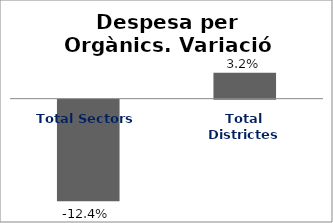
| Category | Series 0 |
|---|---|
| Total Sectors | -0.124 |
| Total Districtes | 0.032 |